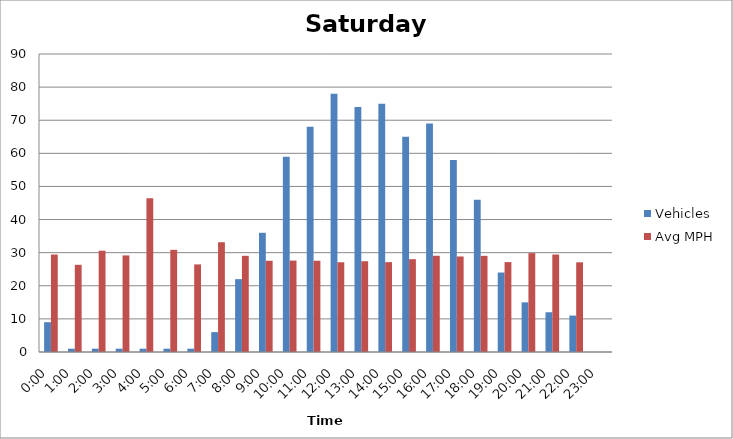
| Category | Vehicles | Avg MPH |
|---|---|---|
| 0:00 | 9 | 29.44 |
| 1:00 | 1 | 26.33 |
| 2:00 | 1 | 30.6 |
| 3:00 | 1 | 29.17 |
| 4:00 | 1 | 46.44 |
| 5:00 | 1 | 30.86 |
| 6:00 | 1 | 26.45 |
| 7:00 | 6 | 33.15 |
| 8:00 | 22 | 29.05 |
| 9:00 | 36 | 27.55 |
| 10:00 | 59 | 27.61 |
| 11:00 | 68 | 27.56 |
| 12:00 | 78 | 27.1 |
| 13:00 | 74 | 27.42 |
| 14:00 | 75 | 27.14 |
| 15:00 | 65 | 28.04 |
| 16:00 | 69 | 29.06 |
| 17:00 | 58 | 28.85 |
| 18:00 | 46 | 29.04 |
| 19:00 | 24 | 27.15 |
| 20:00 | 15 | 29.86 |
| 21:00 | 12 | 29.44 |
| 22:00 | 11 | 27.09 |
| 23:00 | 0 | 0 |